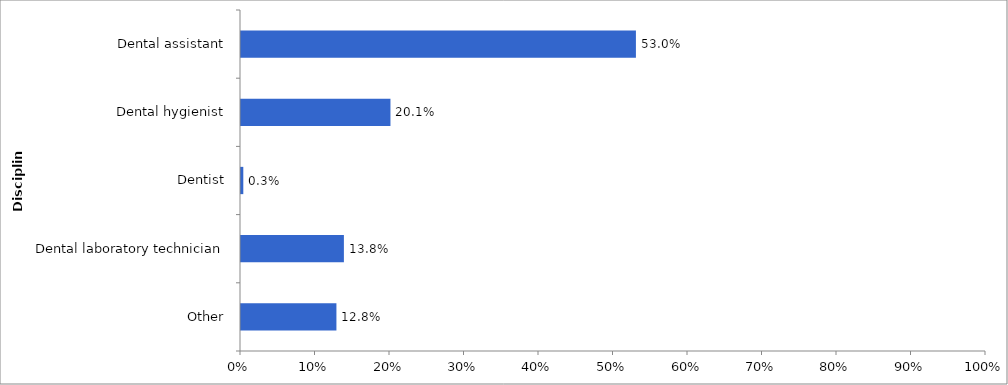
| Category | 2015-16 |
|---|---|
| Other | 0.128 |
| Dental laboratory technician | 0.138 |
| Dentist | 0.003 |
| Dental hygienist | 0.201 |
| Dental assistant | 0.53 |